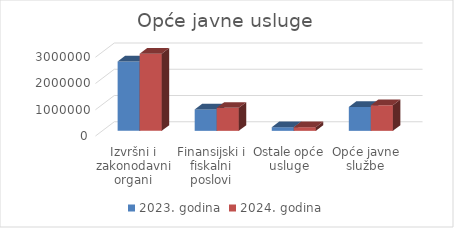
| Category | 2023. godina | 2024. godina |
|---|---|---|
| Izvršni i zakonodavni organi | 2640762 | 2935628 |
| Finansijski i fiskalni poslovi | 816409 | 875290 |
| Ostale opće usluge | 139500 | 139500 |
| Opće javne službe | 910968 | 975060 |